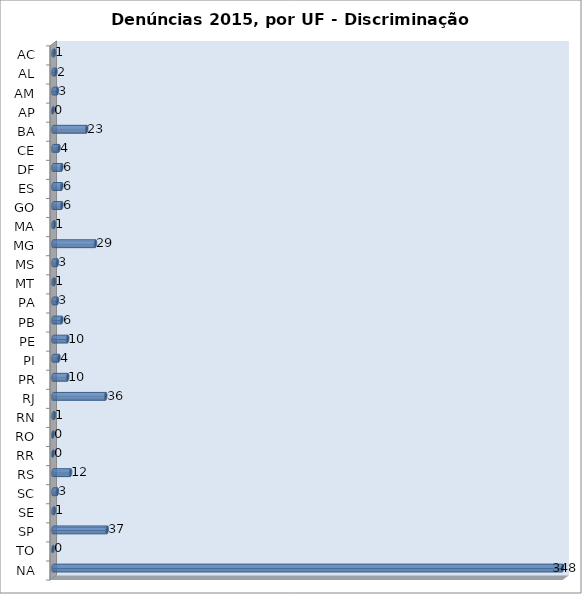
| Category | Series 0 |
|---|---|
| AC | 1 |
| AL | 2 |
| AM | 3 |
| AP | 0 |
| BA | 23 |
| CE | 4 |
| DF | 6 |
| ES | 6 |
| GO | 6 |
| MA | 1 |
| MG | 29 |
| MS | 3 |
| MT | 1 |
| PA | 3 |
| PB | 6 |
| PE | 10 |
| PI | 4 |
| PR | 10 |
| RJ | 36 |
| RN | 1 |
| RO | 0 |
| RR | 0 |
| RS | 12 |
| SC | 3 |
| SE | 1 |
| SP | 37 |
| TO | 0 |
| NA | 348 |